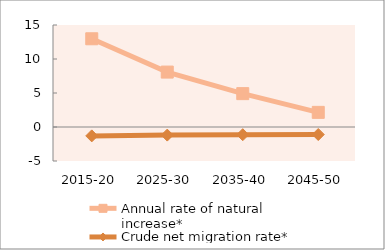
| Category | Annual rate of natural increase* | Crude net migration rate* |
|---|---|---|
| 2015-20 | 12.974 | -1.307 |
| 2025-30 | 8.076 | -1.192 |
| 2035-40 | 4.908 | -1.131 |
| 2045-50 | 2.152 | -1.104 |